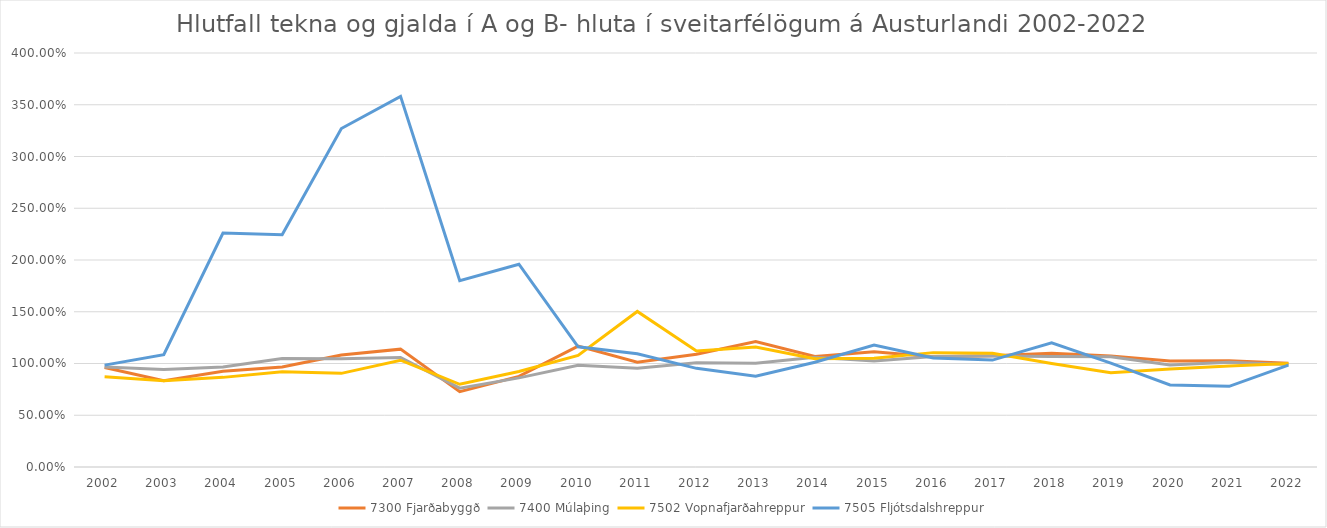
| Category | 7300 Fjarðabyggð | 7400 Múlaþing | 7502 Vopnafjarðahreppur | 7505 Fljótsdalshreppur |
|---|---|---|---|---|
| 2002.0 | 0.962 | 0.965 | 0.872 | 0.984 |
| 2003.0 | 0.833 | 0.943 | 0.834 | 1.085 |
| 2004.0 | 0.924 | 0.967 | 0.866 | 2.26 |
| 2005.0 | 0.965 | 1.047 | 0.92 | 2.245 |
| 2006.0 | 1.082 | 1.045 | 0.905 | 3.27 |
| 2007.0 | 1.139 | 1.058 | 1.032 | 3.581 |
| 2008.0 | 0.728 | 0.762 | 0.799 | 1.8 |
| 2009.0 | 0.876 | 0.861 | 0.922 | 1.959 |
| 2010.0 | 1.168 | 0.982 | 1.079 | 1.162 |
| 2011.0 | 1.013 | 0.954 | 1.503 | 1.094 |
| 2012.0 | 1.09 | 1.007 | 1.122 | 0.953 |
| 2013.0 | 1.212 | 1.003 | 1.159 | 0.878 |
| 2014.0 | 1.068 | 1.061 | 1.046 | 1.012 |
| 2015.0 | 1.112 | 1.023 | 1.052 | 1.178 |
| 2016.0 | 1.066 | 1.067 | 1.105 | 1.053 |
| 2017.0 | 1.074 | 1.072 | 1.099 | 1.033 |
| 2018.0 | 1.1 | 1.067 | 0.999 | 1.2 |
| 2019.0 | 1.073 | 1.066 | 0.91 | 1.003 |
| 2020.0 | 1.025 | 0.985 | 0.947 | 0.792 |
| 2021.0 | 1.026 | 1.012 | 0.976 | 0.78 |
| 2022.0 | 1.003 | 0.991 | 1.001 | 0.985 |